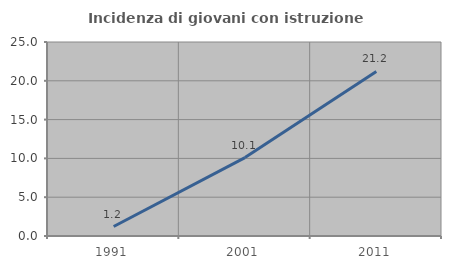
| Category | Incidenza di giovani con istruzione universitaria |
|---|---|
| 1991.0 | 1.22 |
| 2001.0 | 10.106 |
| 2011.0 | 21.212 |